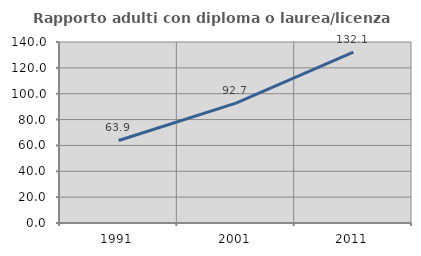
| Category | Rapporto adulti con diploma o laurea/licenza media  |
|---|---|
| 1991.0 | 63.85 |
| 2001.0 | 92.737 |
| 2011.0 | 132.084 |